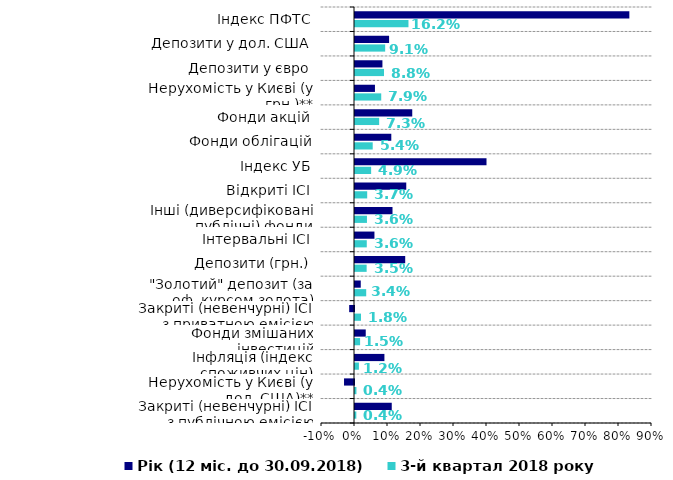
| Category | 3-й квартал 2018 року | Рік (12 міс. до 30.09.2018) |
|---|---|---|
| Закриті (невенчурні) ІСІ з публічною емісією | 0.004 | 0.111 |
| Нерухомість у Києві (у дол. США)** | 0.004 | -0.03 |
| Інфляція (індекс споживчих цін) | 0.012 | 0.089 |
| Фонди змішаних інвестицій | 0.015 | 0.033 |
| Закриті (невенчурні) ІСІ з приватною емісією | 0.018 | -0.015 |
| "Золотий" депозит (за оф. курсом золота) | 0.034 | 0.017 |
| Депозити (грн.) | 0.035 | 0.152 |
| Інтервальні ІСІ | 0.036 | 0.059 |
| Інші (диверсифіковані публічні) фонди | 0.036 | 0.114 |
| Відкриті ІСІ | 0.037 | 0.155 |
| Індекс УБ | 0.049 | 0.398 |
| Фонди облігацій | 0.054 | 0.11 |
| Фонди акцій | 0.073 | 0.173 |
| Нерухомість у Києві (у грн.)** | 0.079 | 0.06 |
| Депозити у євро | 0.088 | 0.083 |
| Депозити у дол. США | 0.091 | 0.103 |
| Індекс ПФТС | 0.162 | 0.831 |